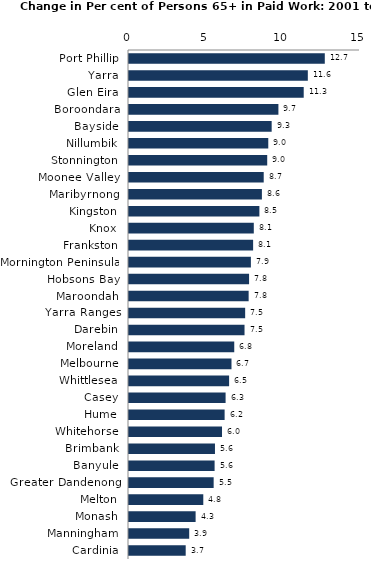
| Category | Series 0 |
|---|---|
| Port Phillip | 12.714 |
| Yarra | 11.612 |
| Glen Eira | 11.345 |
| Boroondara | 9.702 |
| Bayside | 9.264 |
| Nillumbik | 9.044 |
| Stonnington | 8.975 |
| Moonee Valley | 8.747 |
| Maribyrnong | 8.63 |
| Kingston | 8.466 |
| Knox | 8.104 |
| Frankston | 8.06 |
| Mornington Peninsula | 7.915 |
| Hobsons Bay | 7.797 |
| Maroondah | 7.769 |
| Yarra Ranges | 7.543 |
| Darebin | 7.502 |
| Moreland | 6.834 |
| Melbourne | 6.655 |
| Whittlesea | 6.5 |
| Casey | 6.272 |
| Hume | 6.209 |
| Whitehorse | 6.04 |
| Brimbank | 5.582 |
| Banyule | 5.559 |
| Greater Dandenong | 5.497 |
| Melton | 4.824 |
| Monash | 4.325 |
| Manningham | 3.909 |
| Cardinia | 3.682 |